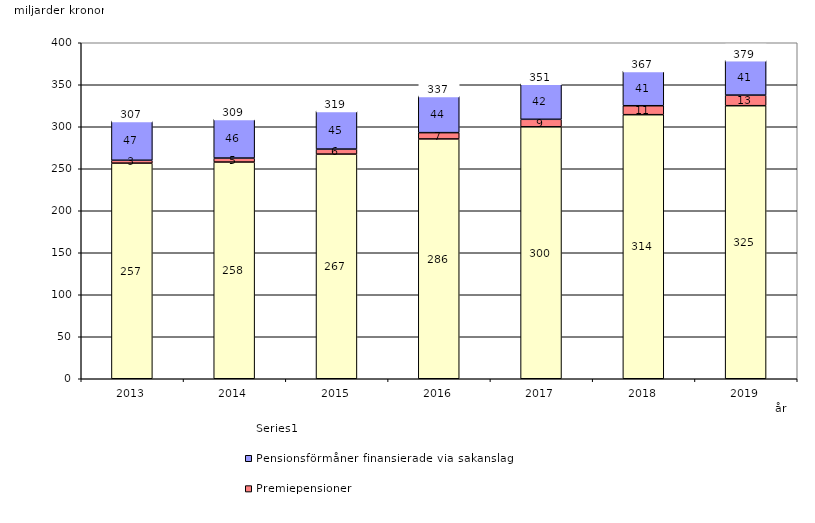
| Category | Inkomstpension och tilläggspension m.m. | Premiepensioner | Pensionsförmåner finansierade via sakanslag | Series 0 |
|---|---|---|---|---|
| 2013.0 | 256.702 | 3.406 | 46.818 | 20 |
| 2014.0 | 257.988 | 4.739 | 46.4 | 20 |
| 2015.0 | 267.448 | 5.983 | 45.422 | 20 |
| 2016.0 | 285.506 | 7.472 | 43.755 | 20 |
| 2017.0 | 299.93 | 8.954 | 42.401 | 20 |
| 2018.0 | 314.376 | 10.658 | 41.451 | 20 |
| 2019.0 | 325.058 | 12.626 | 41.412 | 20 |